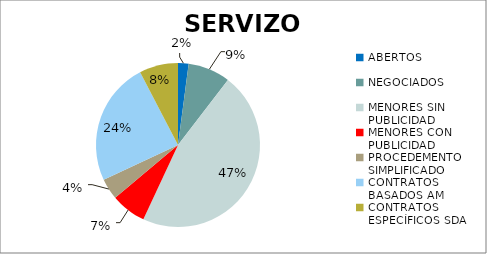
| Category | Series 0 |
|---|---|
| ABERTOS  | 0.021 |
| NEGOCIADOS  | 0.083 |
| MENORES SIN PUBLICIDAD | 0.465 |
| MENORES CON PUBLICIDAD | 0.069 |
| PROCEDEMENTO SIMPLIFICADO | 0.042 |
| CONTRATOS BASADOS AM | 0.243 |
| CONTRATOS ESPECÍFICOS SDA | 0.076 |